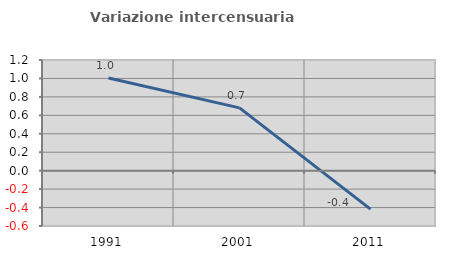
| Category | Variazione intercensuaria annua |
|---|---|
| 1991.0 | 1.005 |
| 2001.0 | 0.681 |
| 2011.0 | -0.417 |